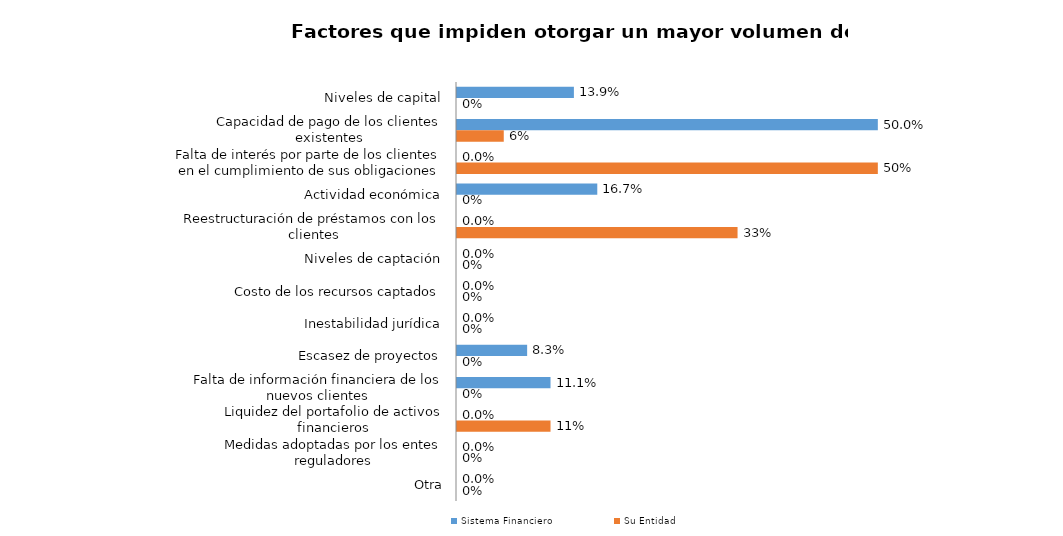
| Category | Sistema Financiero | Su Entidad |
|---|---|---|
| Niveles de capital | 0.139 | 0 |
| Capacidad de pago de los clientes existentes | 0.5 | 0.056 |
| Falta de interés por parte de los clientes en el cumplimiento de sus obligaciones | 0 | 0.5 |
| Actividad económica | 0.167 | 0 |
| Reestructuración de préstamos con los clientes | 0 | 0.333 |
| Niveles de captación | 0 | 0 |
| Costo de los recursos captados | 0 | 0 |
| Inestabilidad jurídica | 0 | 0 |
| Escasez de proyectos | 0.083 | 0 |
| Falta de información financiera de los nuevos clientes | 0.111 | 0 |
| Liquidez del portafolio de activos financieros | 0 | 0.111 |
| Medidas adoptadas por los entes reguladores | 0 | 0 |
| Otra | 0 | 0 |